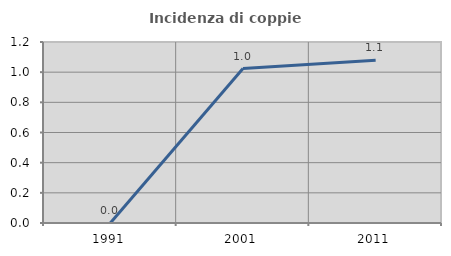
| Category | Incidenza di coppie miste |
|---|---|
| 1991.0 | 0 |
| 2001.0 | 1.024 |
| 2011.0 | 1.079 |